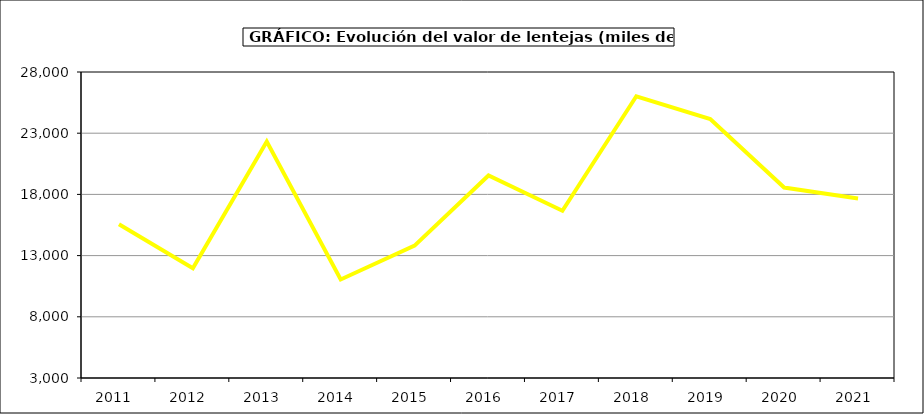
| Category | Valor |
|---|---|
| 2011.0 | 15562.569 |
| 2012.0 | 11960.065 |
| 2013.0 | 22313.5 |
| 2014.0 | 11051.282 |
| 2015.0 | 13811 |
| 2016.0 | 19549 |
| 2017.0 | 16662.624 |
| 2018.0 | 26017.402 |
| 2019.0 | 24153.639 |
| 2020.0 | 18559.488 |
| 2021.0 | 17667.228 |